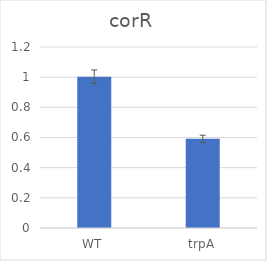
| Category | Series 0 |
|---|---|
| WT | 1.003 |
| trpA | 0.591 |